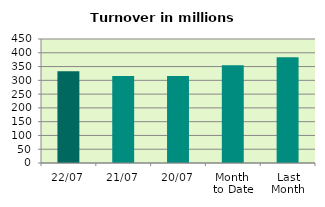
| Category | Series 0 |
|---|---|
| 22/07 | 333.283 |
| 21/07 | 316.153 |
| 20/07 | 315.926 |
| Month 
to Date | 354.887 |
| Last
Month | 384.158 |